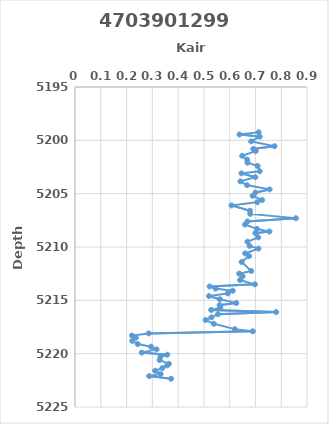
| Category | Series 0 |
|---|---|
| 0.7123333333333334 | 5199.25 |
| 0.638 | 5199.45 |
| 0.7163333333333334 | 5199.65 |
| 0.6833333333333332 | 5200.1 |
| 0.774 | 5200.55 |
| 0.6916666666666668 | 5200.8 |
| 0.701 | 5201 |
| 0.6486666666666667 | 5201.45 |
| 0.6675 | 5201.8 |
| 0.6693333333333333 | 5202.1 |
| 0.7083333333333334 | 5202.4 |
| 0.7166666666666667 | 5202.9 |
| 0.6456666666666667 | 5203.1 |
| 0.6993333333333333 | 5203.45 |
| 0.6416666666666666 | 5203.85 |
| 0.6673333333333334 | 5204.2 |
| 0.755 | 5204.6 |
| 0.6999999999999998 | 5204.9 |
| 0.6890000000000001 | 5205.2 |
| 0.726 | 5205.6 |
| 0.707 | 5205.8 |
| 0.6070000000000001 | 5206.1 |
| 0.6789999999999999 | 5206.6 |
| 0.6796666666666668 | 5206.9 |
| 0.8566666666666668 | 5207.3 |
| 0.6693333333333333 | 5207.6 |
| 0.6592499999999999 | 5207.9 |
| 0.7056666666666667 | 5208.3 |
| 0.7543333333333333 | 5208.55 |
| 0.6996666666666668 | 5208.7 |
| 0.711 | 5209.1 |
| 0.669 | 5209.5 |
| 0.6773333333333333 | 5209.9 |
| 0.7116666666666666 | 5210.15 |
| 0.66025 | 5210.6 |
| 0.6753333333333332 | 5210.85 |
| 0.6465000000000001 | 5211.4 |
| 0.6836666666666668 | 5212.25 |
| 0.637 | 5212.5 |
| 0.650333333 | 5212.75 |
| 0.640333333 | 5213.1 |
| 0.698 | 5213.5 |
| 0.522 | 5213.7 |
| 0.545333333 | 5213.9 |
| 0.612 | 5214.1 |
| 0.59275 | 5214.35 |
| 0.519666667 | 5214.6 |
| 0.562 | 5214.9 |
| 0.625333333 | 5215.25 |
| 0.561 | 5215.45 |
| 0.563666667 | 5215.7 |
| 0.528333333 | 5215.9 |
| 0.780333333 | 5216.1 |
| 0.554333333 | 5216.3 |
| 0.529 | 5216.6 |
| 0.506666667 | 5216.85 |
| 0.538666667 | 5217.2 |
| 0.620333333 | 5217.7 |
| 0.689666667 | 5217.9 |
| 0.285666667 | 5218.1 |
| 0.221333333 | 5218.3 |
| 0.236 | 5218.5 |
| 0.222 | 5218.8 |
| 0.243333333 | 5219.1 |
| 0.295 | 5219.35 |
| 0.316333333 | 5219.6 |
| 0.259 | 5219.9 |
| 0.358 | 5220.1 |
| 0.331333333 | 5220.3 |
| 0.328333333 | 5220.6 |
| 0.364333333 | 5220.95 |
| 0.357666667 | 5221.1 |
| 0.338666667 | 5221.35 |
| 0.311 | 5221.6 |
| 0.332333333 | 5221.9 |
| 0.288 | 5222.1 |
| 0.372666667 | 5222.35 |